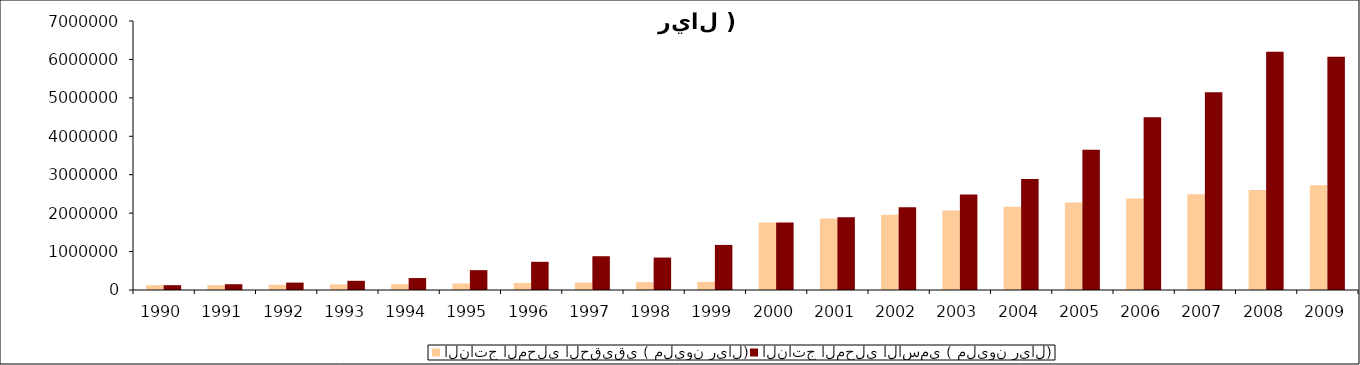
| Category | الناتج المحلي الحقيقي ( مليون ريال) | الناتج المحلي الاسمي ( مليون ريال) |
|---|---|---|
| 1990.0 | 125562 | 125562 |
| 1991.0 | 128931 | 150502 |
| 1992.0 | 136190 | 192424 |
| 1993.0 | 145845 | 239054 |
| 1994.0 | 151286 | 310601 |
| 1995.0 | 170231 | 516643 |
| 1996.0 | 182760 | 733552 |
| 1997.0 | 194515 | 878884 |
| 1998.0 | 204791 | 844240 |
| 1999.0 | 211892 | 1172794 |
| 2000.0 | 1756998.994 | 1756998.994 |
| 2001.0 | 1861246.814 | 1895944.763 |
| 2002.0 | 1955143.718 | 2150894.871 |
| 2003.0 | 2067701.23 | 2486732.143 |
| 2004.0 | 2163550.774 | 2885580.021 |
| 2005.0 | 2274736.143 | 3646557.255 |
| 2006.0 | 2380298.795 | 4495179.45 |
| 2007.0 | 2491775.324 | 5144564.011 |
| 2008.0 | 2604036.897 | 6203045.857 |
| 2009.0 | 2726528.858 | 6069597.623 |